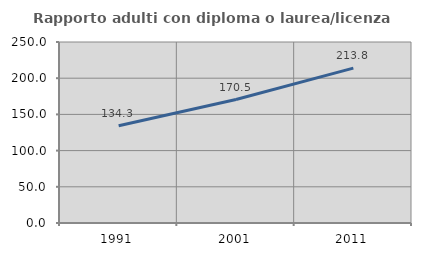
| Category | Rapporto adulti con diploma o laurea/licenza media  |
|---|---|
| 1991.0 | 134.319 |
| 2001.0 | 170.496 |
| 2011.0 | 213.847 |